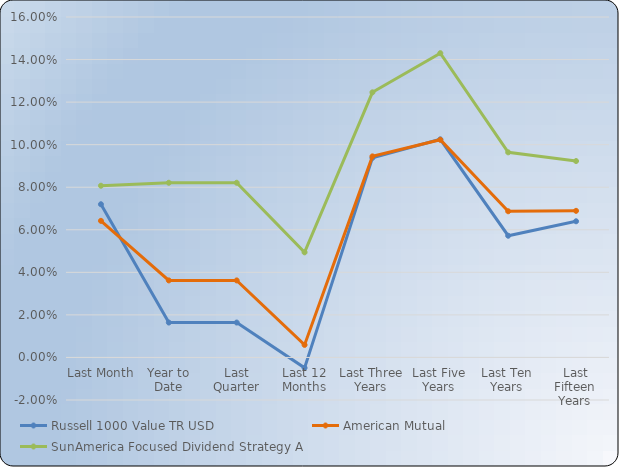
| Category | Russell 1000 Value TR USD | American Mutual | SunAmerica Focused Dividend Strategy A |
|---|---|---|---|
| Last Month | 0.072 | 0.064 | 0.081 |
| Year to Date | 0.016 | 0.036 | 0.082 |
| Last Quarter | 0.016 | 0.036 | 0.082 |
| Last 12 Months | -0.005 | 0.006 | 0.049 |
| Last Three Years | 0.094 | 0.094 | 0.125 |
| Last Five Years | 0.102 | 0.102 | 0.143 |
| Last Ten Years | 0.057 | 0.069 | 0.096 |
| Last Fifteen Years | 0.064 | 0.069 | 0.092 |